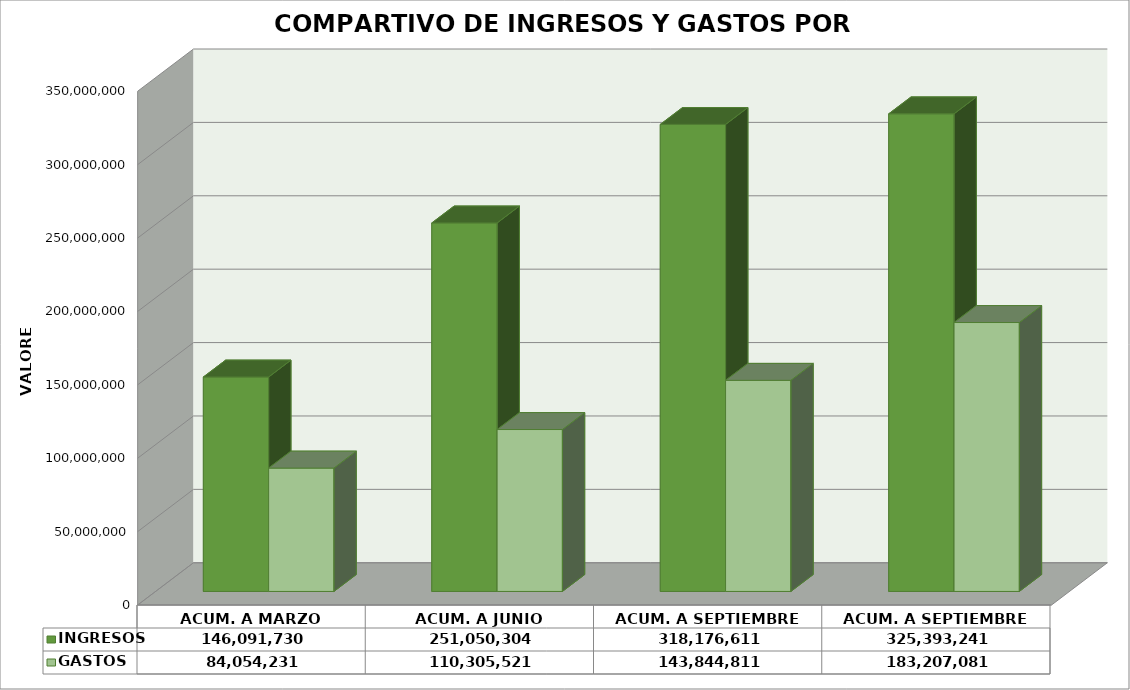
| Category | INGRESOS | GASTOS |
|---|---|---|
| ACUM. A MARZO | 146091730 | 84054231 |
| ACUM. A JUNIO | 251050304 | 110305521 |
| ACUM. A SEPTIEMBRE | 318176611 | 143844811 |
| ACUM. A SEPTIEMBRE | 325393241 | 183207081 |